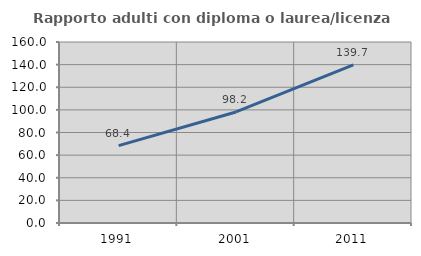
| Category | Rapporto adulti con diploma o laurea/licenza media  |
|---|---|
| 1991.0 | 68.394 |
| 2001.0 | 98.174 |
| 2011.0 | 139.691 |